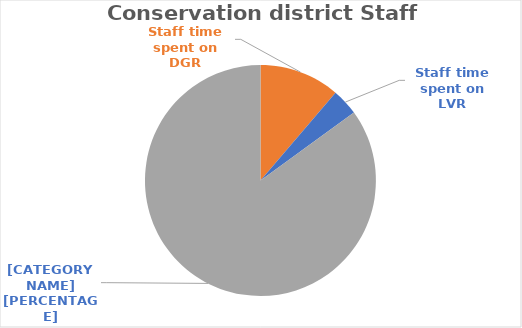
| Category | Series 0 |
|---|---|
| Staff time spent on DGR | 1.125 |
| Staff time spent on LVR | 0.375 |
| Staff time NOT spent on DGLVR | 8.5 |